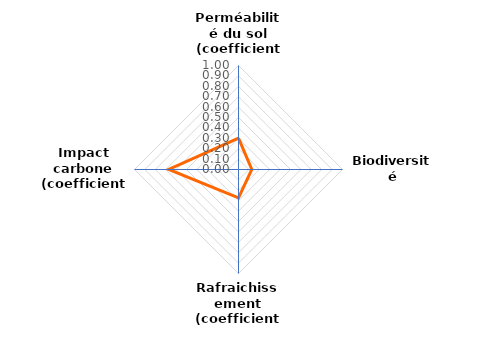
| Category | Series 0 |
|---|---|
| Perméabilité du sol (coefficient) | 0.301 |
| Biodiversité (coefficient) | 0.128 |
| Rafraichissement (coefficient) | 0.272 |
| Impact carbone (coefficient) | 0.671 |